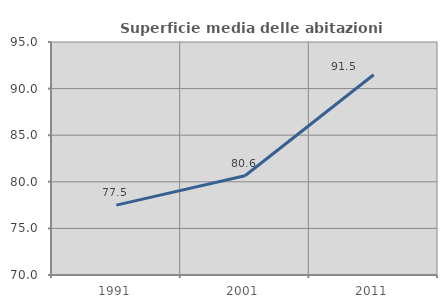
| Category | Superficie media delle abitazioni occupate |
|---|---|
| 1991.0 | 77.498 |
| 2001.0 | 80.645 |
| 2011.0 | 91.485 |